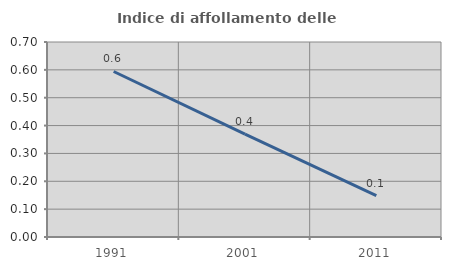
| Category | Indice di affollamento delle abitazioni  |
|---|---|
| 1991.0 | 0.594 |
| 2001.0 | 0.369 |
| 2011.0 | 0.149 |